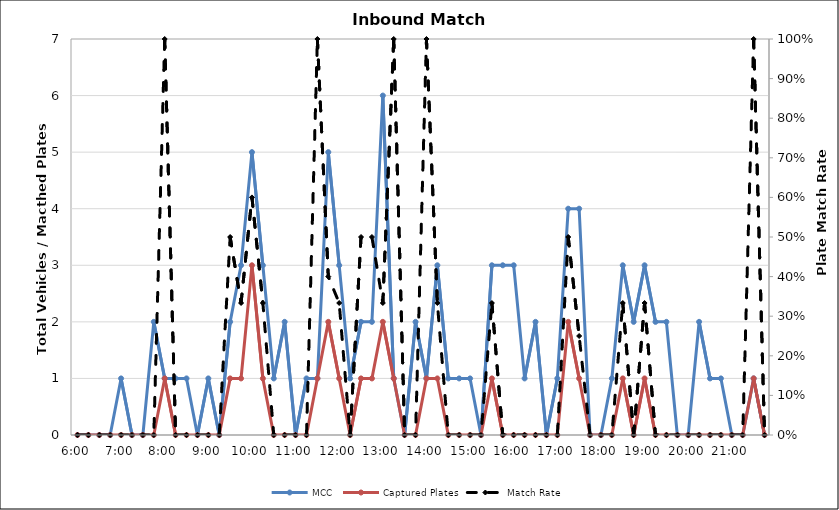
| Category | MCC | Captured Plates |
|---|---|---|
| 0.25 | 0 | 0 |
| 0.260416666666667 | 0 | 0 |
| 0.270833333333333 | 0 | 0 |
| 0.28125 | 0 | 0 |
| 0.291666666666667 | 1 | 0 |
| 0.302083333333333 | 0 | 0 |
| 0.3125 | 0 | 0 |
| 0.322916666666667 | 2 | 0 |
| 0.333333333333333 | 1 | 1 |
| 0.34375 | 1 | 0 |
| 0.354166666666667 | 1 | 0 |
| 0.364583333333333 | 0 | 0 |
| 0.375 | 1 | 0 |
| 0.385416666666667 | 0 | 0 |
| 0.395833333333333 | 2 | 1 |
| 0.40625 | 3 | 1 |
| 0.416666666666667 | 5 | 3 |
| 0.427083333333333 | 3 | 1 |
| 0.4375 | 1 | 0 |
| 0.447916666666667 | 2 | 0 |
| 0.458333333333333 | 0 | 0 |
| 0.46875 | 1 | 0 |
| 0.479166666666667 | 1 | 1 |
| 0.489583333333333 | 5 | 2 |
| 0.5 | 3 | 1 |
| 0.510416666666667 | 1 | 0 |
| 0.520833333333333 | 2 | 1 |
| 0.53125 | 2 | 1 |
| 0.541666666666667 | 6 | 2 |
| 0.552083333333333 | 1 | 1 |
| 0.5625 | 0 | 0 |
| 0.572916666666667 | 2 | 0 |
| 0.583333333333333 | 1 | 1 |
| 0.59375 | 3 | 1 |
| 0.604166666666667 | 1 | 0 |
| 0.614583333333333 | 1 | 0 |
| 0.625 | 1 | 0 |
| 0.635416666666667 | 0 | 0 |
| 0.645833333333333 | 3 | 1 |
| 0.65625 | 3 | 0 |
| 0.666666666666667 | 3 | 0 |
| 0.677083333333333 | 1 | 0 |
| 0.6875 | 2 | 0 |
| 0.697916666666667 | 0 | 0 |
| 0.708333333333333 | 1 | 0 |
| 0.71875 | 4 | 2 |
| 0.729166666666667 | 4 | 1 |
| 0.739583333333333 | 0 | 0 |
| 0.75 | 0 | 0 |
| 0.760416666666667 | 1 | 0 |
| 0.770833333333333 | 3 | 1 |
| 0.78125 | 2 | 0 |
| 0.791666666666667 | 3 | 1 |
| 0.802083333333333 | 2 | 0 |
| 0.8125 | 2 | 0 |
| 0.822916666666667 | 0 | 0 |
| 0.833333333333333 | 0 | 0 |
| 0.84375 | 2 | 0 |
| 0.854166666666667 | 1 | 0 |
| 0.864583333333333 | 1 | 0 |
| 0.875 | 0 | 0 |
| 0.885416666666667 | 0 | 0 |
| 0.895833333333333 | 1 | 1 |
| 0.90625 | 0 | 0 |